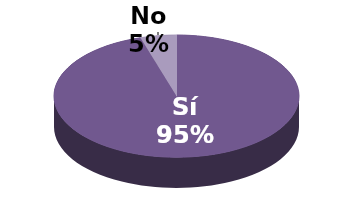
| Category | Series 1 |
|---|---|
| Sí | 20 |
| No | 1 |